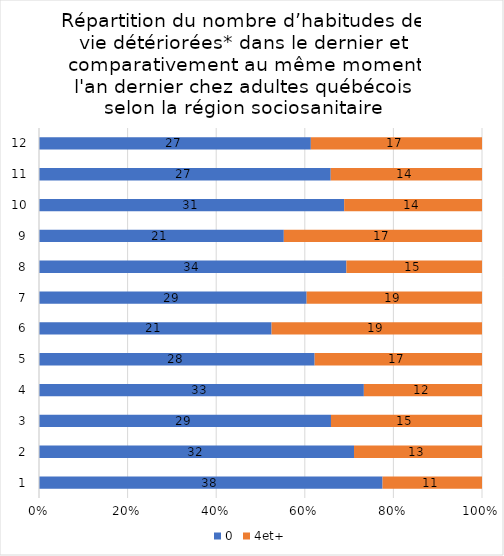
| Category | 0 | 4et+ |
|---|---|---|
| 0 | 38 | 11 |
| 1 | 32 | 13 |
| 2 | 29 | 15 |
| 3 | 33 | 12 |
| 4 | 28 | 17 |
| 5 | 21 | 19 |
| 6 | 29 | 19 |
| 7 | 34 | 15 |
| 8 | 21 | 17 |
| 9 | 31 | 14 |
| 10 | 27 | 14 |
| 11 | 27 | 17 |